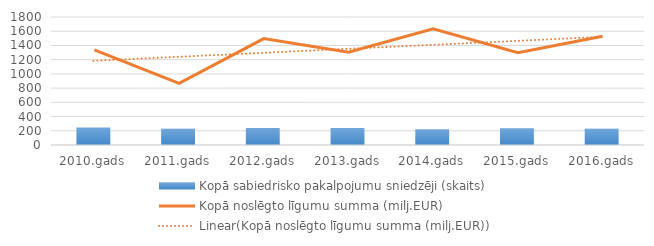
| Category | Kopā sabiedrisko pakalpojumu sniedzēji (skaits) |
|---|---|
| 2010.gads | 247 |
| 2011.gads | 228 |
| 2012.gads | 240 |
| 2013.gads | 238 |
| 2014.gads | 221 |
| 2015.gads | 235 |
| 2016.gads | 228 |